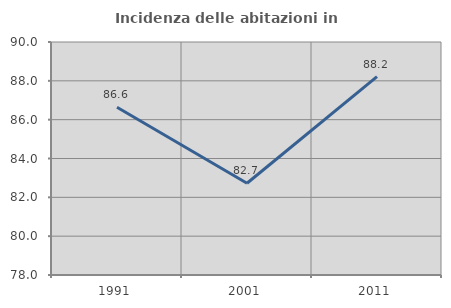
| Category | Incidenza delle abitazioni in proprietà  |
|---|---|
| 1991.0 | 86.643 |
| 2001.0 | 82.724 |
| 2011.0 | 88.217 |